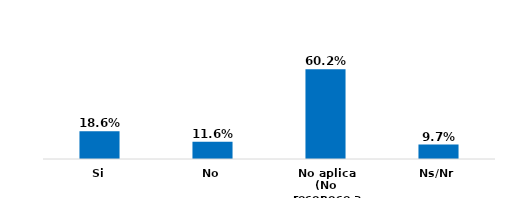
| Category | Series 0 |
|---|---|
| Si | 0.186 |
| No | 0.116 |
| No aplica (No reconoce a ninguno) | 0.602 |
| Ns/Nr | 0.097 |